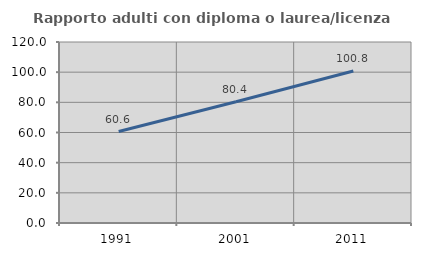
| Category | Rapporto adulti con diploma o laurea/licenza media  |
|---|---|
| 1991.0 | 60.613 |
| 2001.0 | 80.394 |
| 2011.0 | 100.792 |